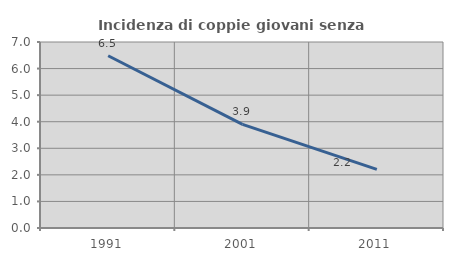
| Category | Incidenza di coppie giovani senza figli |
|---|---|
| 1991.0 | 6.482 |
| 2001.0 | 3.901 |
| 2011.0 | 2.206 |